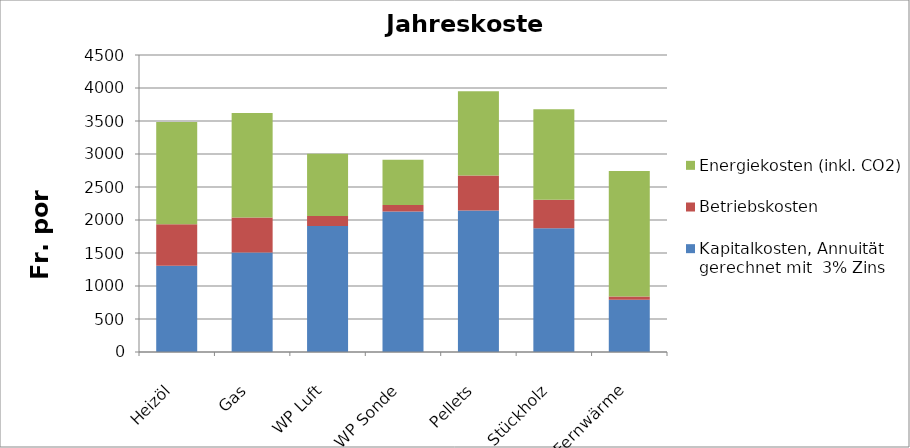
| Category | Kapitalkosten, Annuität gerechnet mit  3% Zins | Betriebskosten | Energiekosten (inkl. CO2) |
|---|---|---|---|
| Heizöl | 1306.5 | 630 | 1550 |
| Gas | 1507.5 | 530 | 1582 |
| WP Luft | 1909.5 | 150 | 943.077 |
| WP Sonde | 2127.5 | 100 | 686.667 |
| Pellets | 2144 | 530 | 1278 |
| Stückholz | 1876 | 430 | 1370.782 |
| Fernwärme | 790.5 | 50 | 1902 |